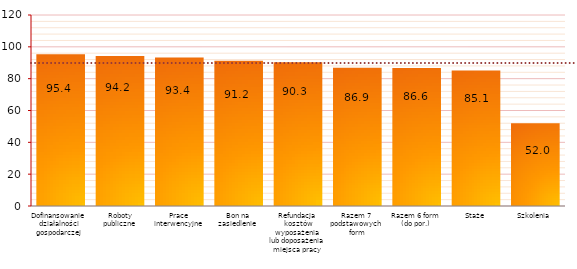
| Category | Efektywność zatrudnieniowa (w proc.) |
|---|---|
| Dofinansowanie działalności gospodarczej | 95.396 |
| Roboty publiczne | 94.236 |
| Prace interwencyjne | 93.357 |
| Bon na zasiedlenie | 91.209 |
| Refundacja kosztów wyposażenia lub doposażenia miejsca pracy | 90.288 |
| Razem 7 podstawowych form | 86.886 |
| Razem 6 form (do por.) | 86.647 |
| Staże | 85.072 |
| Szkolenia | 52.032 |